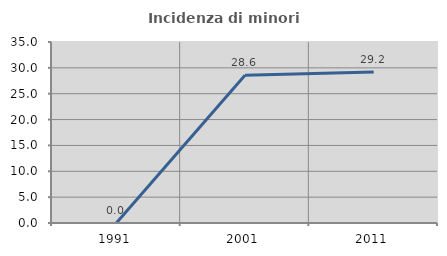
| Category | Incidenza di minori stranieri |
|---|---|
| 1991.0 | 0 |
| 2001.0 | 28.571 |
| 2011.0 | 29.192 |